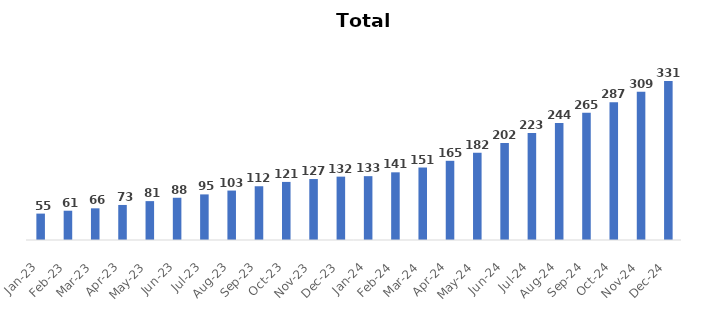
| Category | Total Customers |
|---|---|
| 2023-01-31 | 55 |
| 2023-02-28 | 61 |
| 2023-03-31 | 66 |
| 2023-04-30 | 73 |
| 2023-05-31 | 81 |
| 2023-06-30 | 88 |
| 2023-07-31 | 95 |
| 2023-08-31 | 103 |
| 2023-09-30 | 112 |
| 2023-10-31 | 121 |
| 2023-11-30 | 127 |
| 2023-12-31 | 132 |
| 2024-01-31 | 133 |
| 2024-02-29 | 141 |
| 2024-03-31 | 151 |
| 2024-04-30 | 165 |
| 2024-05-31 | 182 |
| 2024-06-30 | 202 |
| 2024-07-31 | 223 |
| 2024-08-31 | 244 |
| 2024-09-30 | 265 |
| 2024-10-31 | 287 |
| 2024-11-30 | 309 |
| 2024-12-31 | 331 |